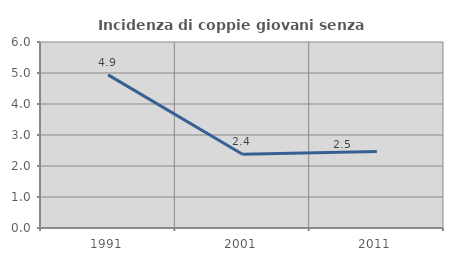
| Category | Incidenza di coppie giovani senza figli |
|---|---|
| 1991.0 | 4.938 |
| 2001.0 | 2.381 |
| 2011.0 | 2.469 |